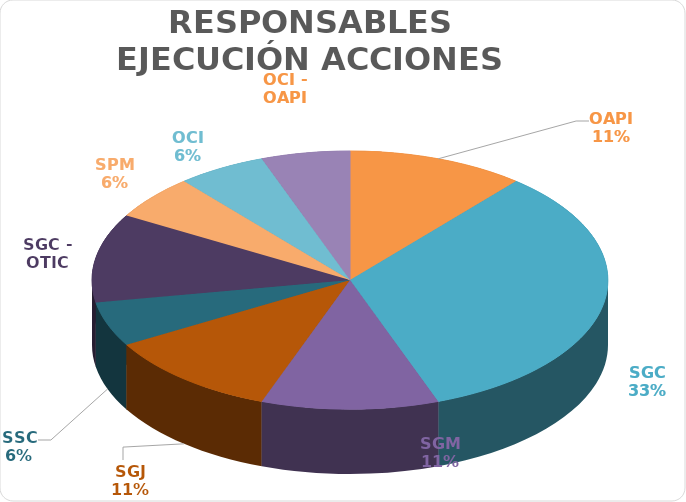
| Category | Series 0 |
|---|---|
| OAPI | 2 |
| SGC | 6 |
| SGM | 2 |
| SGJ | 2 |
| SSC | 1 |
| SGC - OTIC | 2 |
| SPM | 1 |
| OCI | 1 |
| OCI - OAPI | 1 |